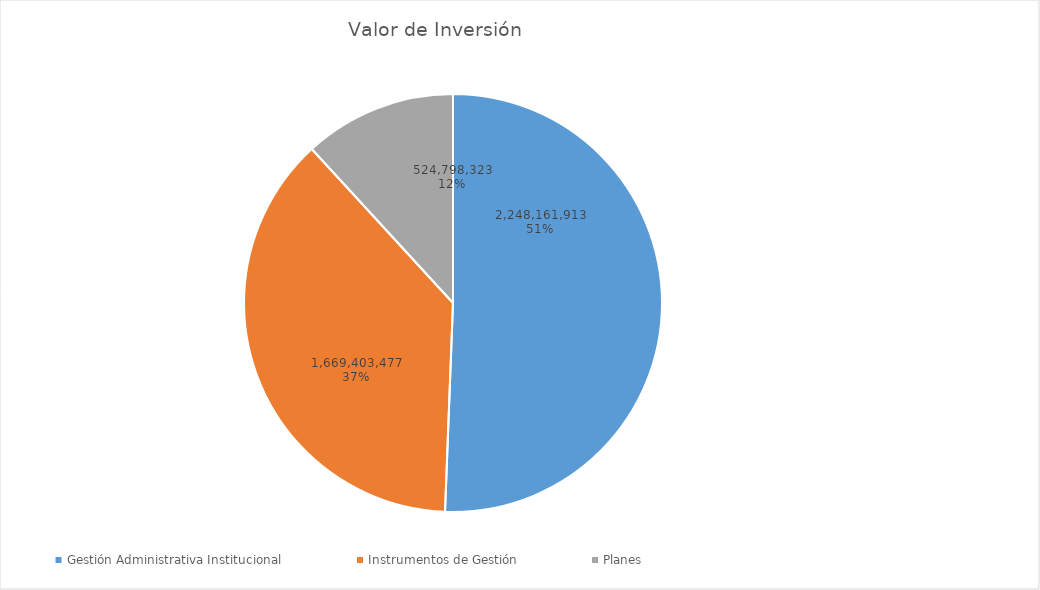
| Category | Valor de Inversión | Porcentaje de Ejecución dentro de la Actividad |
|---|---|---|
| Gestión Administrativa Institucional | 2248161913 | 8 |
| Instrumentos de Gestión | 1669403477 | 10 |
| Planes | 524798323 | 4 |